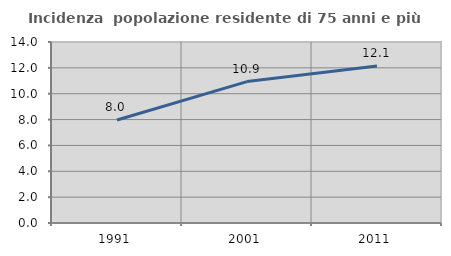
| Category | Incidenza  popolazione residente di 75 anni e più |
|---|---|
| 1991.0 | 7.965 |
| 2001.0 | 10.937 |
| 2011.0 | 12.137 |